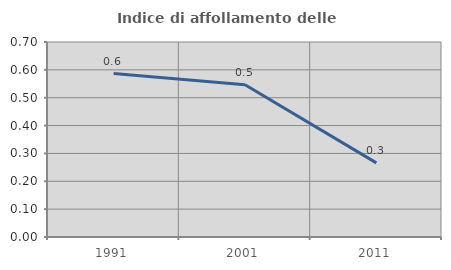
| Category | Indice di affollamento delle abitazioni  |
|---|---|
| 1991.0 | 0.587 |
| 2001.0 | 0.546 |
| 2011.0 | 0.266 |